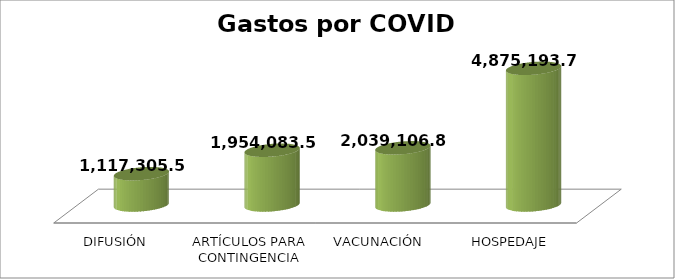
| Category | SUMA |
|---|---|
| DIFUSIÓN  | 1117305.57 |
| ARTÍCULOS PARA CONTINGENCIA | 1954083.5 |
| VACUNACIÓN | 2039106.87 |
| HOSPEDAJE | 4875193.75 |